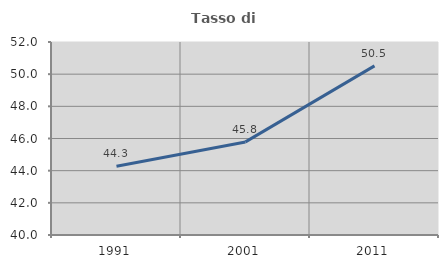
| Category | Tasso di occupazione   |
|---|---|
| 1991.0 | 44.279 |
| 2001.0 | 45.788 |
| 2011.0 | 50.515 |